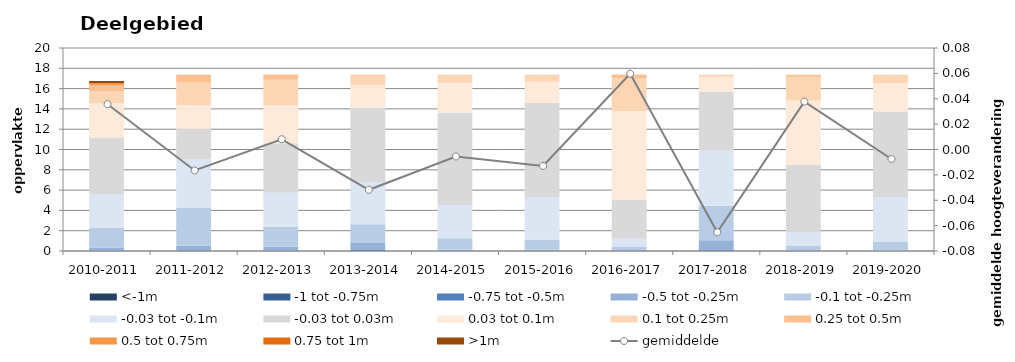
| Category | <-1m | -1 tot -0.75m | -0.75 tot -0.5m | -0.5 tot -0.25m | -0.1 tot -0.25m | -0.03 tot -0.1m | -0.03 tot 0.03m | 0.03 tot 0.1m | 0.1 tot 0.25m | 0.25 tot 0.5m | 0.5 tot 0.75m | 0.75 tot 1m | >1m |
|---|---|---|---|---|---|---|---|---|---|---|---|---|---|
| 2010-2011 | 0.001 | 0.003 | 0.018 | 0.312 | 1.947 | 3.325 | 5.565 | 3.388 | 1.169 | 0.624 | 0.153 | 0.053 | 0.19 |
| 2011-2012 | 0 | 0.004 | 0.04 | 0.468 | 3.772 | 4.746 | 3.014 | 2.304 | 2.279 | 0.684 | 0.051 | 0.007 | 0.001 |
| 2012-2013 | 0 | 0.001 | 0.021 | 0.397 | 1.965 | 3.35 | 4.885 | 3.743 | 2.503 | 0.48 | 0.023 | 0.003 | 0 |
| 2013-2014 | 0.004 | 0.009 | 0.094 | 0.69 | 1.829 | 4.184 | 7.34 | 2.238 | 0.879 | 0.096 | 0.008 | 0 | 0 |
| 2014-2015 | 0 | 0.002 | 0.004 | 0.124 | 1.116 | 3.287 | 9.1 | 2.944 | 0.724 | 0.062 | 0.005 | 0.001 | 0 |
| 2015-2016 | 0.01 | 0.004 | 0.011 | 0.099 | 0.98 | 4.217 | 9.256 | 2.106 | 0.615 | 0.066 | 0.005 | 0 | 0 |
| 2016-2017 | 0 | 0.001 | 0.008 | 0.078 | 0.357 | 0.774 | 3.866 | 8.682 | 3.258 | 0.302 | 0.025 | 0.007 | 0.011 |
| 2017-2018 | 0 | 0.004 | 0.067 | 0.98 | 3.411 | 5.418 | 5.842 | 1.436 | 0.181 | 0.024 | 0.006 | 0.001 | 0 |
| 2018-2019 | 0 | 0.001 | 0.006 | 0.063 | 0.417 | 1.369 | 6.608 | 6.363 | 2.35 | 0.189 | 0.004 | 0.001 | 0 |
| 2019-2020 | 0 | 0 | 0.002 | 0.059 | 0.869 | 4.388 | 8.429 | 2.8 | 0.77 | 0.052 | 0.001 | 0 | 0 |